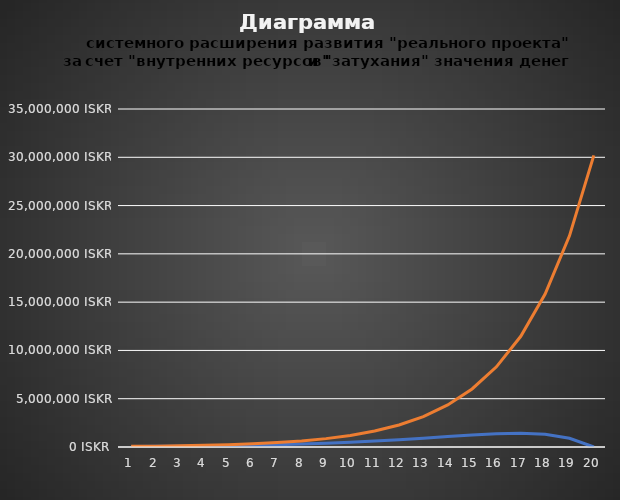
| Category | Series 0 | Series 1 |
|---|---|---|
| 0 | 51627.833 | 65541.534 |
| 1 | 67543.18 | 90509.738 |
| 2 | 88092.032 | 124989.638 |
| 3 | 114494.965 | 172604.738 |
| 4 | 148230.089 | 238358.924 |
| 5 | 191052.115 | 329162.324 |
| 6 | 244988.596 | 454557.495 |
| 7 | 312293.156 | 627722.256 |
| 8 | 395323.479 | 866854.543 |
| 9 | 496293.545 | 1197084.846 |
| 10 | 616821.978 | 1653117.168 |
| 11 | 757157.136 | 2282876.089 |
| 12 | 914898.207 | 3152543.17 |
| 13 | 1082940.734 | 4353511.997 |
| 14 | 1246241.321 | 6011992.758 |
| 15 | 1376799.936 | 8302275.713 |
| 16 | 1425971.362 | 11465047.413 |
| 17 | 1312799.032 | 15832684.523 |
| 18 | 906456.474 | 21864183.388 |
| 19 | 0 | 30193396.108 |